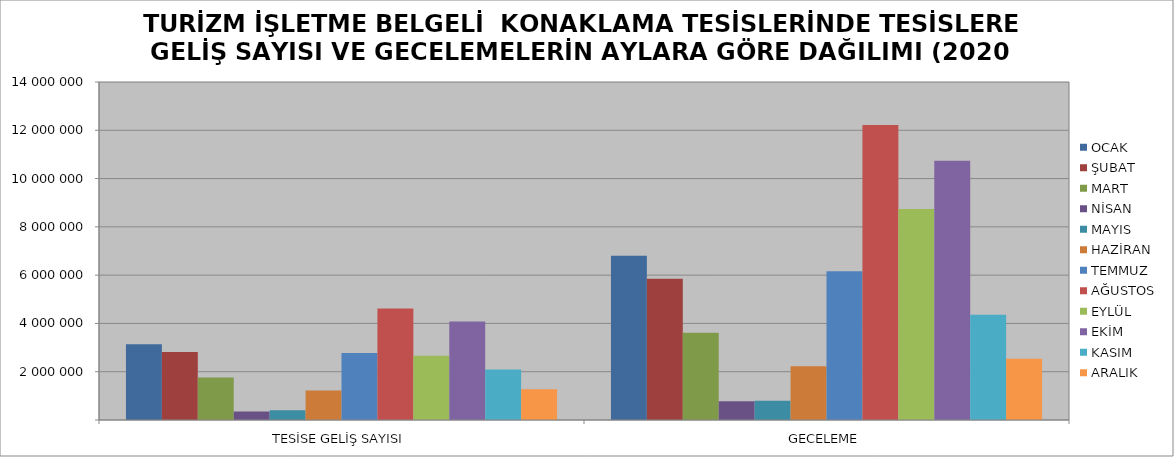
| Category | OCAK | ŞUBAT | MART | NİSAN | MAYIS | HAZİRAN | TEMMUZ | AĞUSTOS | EYLÜL | EKİM | KASIM | ARALIK |
|---|---|---|---|---|---|---|---|---|---|---|---|---|
| TESİSE GELİŞ SAYISI | 3140857 | 2816145 | 1756166 | 346964 | 400777 | 1222339 | 2777113 | 4617108 | 2662829 | 4080440 | 2090089 | 1272583 |
| GECELEME | 6806196 | 5853519 | 3616071 | 781724 | 800953 | 2221474 | 6159447 | 12220419 | 8734576 | 10738693 | 4356780 | 2539332 |